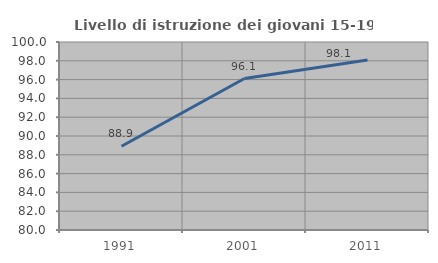
| Category | Livello di istruzione dei giovani 15-19 anni |
|---|---|
| 1991.0 | 88.905 |
| 2001.0 | 96.112 |
| 2011.0 | 98.085 |